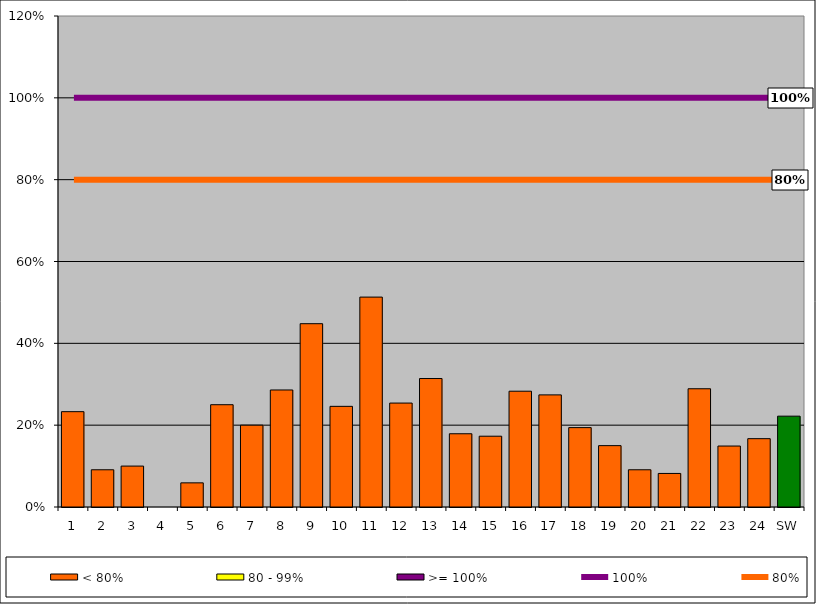
| Category | < 80% | 80 - 99% | >= 100% |
|---|---|---|---|
| 1 | 0.233 | 0 | 0 |
| 2 | 0.091 | 0 | 0 |
| 3 | 0.1 | 0 | 0 |
| 4 | 0 | 0 | 0 |
| 5 | 0.059 | 0 | 0 |
| 6 | 0.25 | 0 | 0 |
| 7 | 0.2 | 0 | 0 |
| 8 | 0.286 | 0 | 0 |
| 9 | 0.448 | 0 | 0 |
| 10 | 0.246 | 0 | 0 |
| 11 | 0.513 | 0 | 0 |
| 12 | 0.254 | 0 | 0 |
| 13 | 0.314 | 0 | 0 |
| 14 | 0.179 | 0 | 0 |
| 15 | 0.173 | 0 | 0 |
| 16 | 0.283 | 0 | 0 |
| 17 | 0.274 | 0 | 0 |
| 18 | 0.194 | 0 | 0 |
| 19 | 0.15 | 0 | 0 |
| 20 | 0.091 | 0 | 0 |
| 21 | 0.082 | 0 | 0 |
| 22 | 0.289 | 0 | 0 |
| 23 | 0.149 | 0 | 0 |
| 24 | 0.167 | 0 | 0 |
| SW | 0.222 | 0 | 0 |